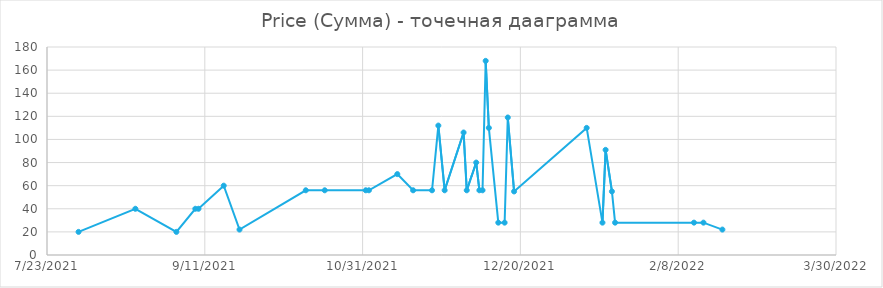
| Category | Price (Сумма) |
|---|---|
| 44410.0 | 20 |
| 44428.0 | 40 |
| 44441.0 | 20 |
| 44447.0 | 40 |
| 44448.0 | 40 |
| 44456.0 | 60 |
| 44461.0 | 22 |
| 44482.0 | 56 |
| 44488.0 | 56 |
| 44501.0 | 56 |
| 44502.0 | 56 |
| 44511.0 | 70 |
| 44516.0 | 56 |
| 44522.0 | 56 |
| 44524.0 | 112 |
| 44526.0 | 56 |
| 44532.0 | 106 |
| 44533.0 | 56 |
| 44536.0 | 80 |
| 44537.0 | 56 |
| 44538.0 | 56 |
| 44539.0 | 168 |
| 44540.0 | 110 |
| 44543.0 | 28 |
| 44545.0 | 28 |
| 44546.0 | 119 |
| 44548.0 | 55 |
| 44571.0 | 110 |
| 44576.0 | 28 |
| 44577.0 | 91 |
| 44579.0 | 55 |
| 44580.0 | 28 |
| 44605.0 | 28 |
| 44608.0 | 28 |
| 44614.0 | 22 |